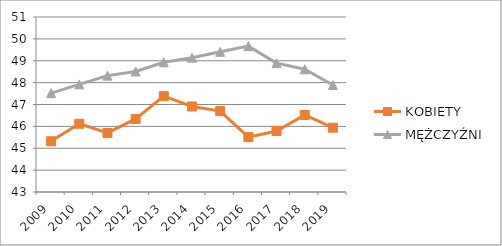
| Category | KOBIETY | MĘŻCZYŹNI |
|---|---|---|
| 2009.0 | 45.32 | 47.52 |
| 2010.0 | 46.12 | 47.92 |
| 2011.0 | 45.7 | 48.32 |
| 2012.0 | 46.34 | 48.51 |
| 2013.0 | 47.38 | 48.93 |
| 2014.0 | 46.91 | 49.14 |
| 2015.0 | 46.7 | 49.41 |
| 2016.0 | 45.51 | 49.67 |
| 2017.0 | 45.79 | 48.89 |
| 2018.0 | 46.52 | 48.61 |
| 2019.0 | 45.94 | 47.89 |